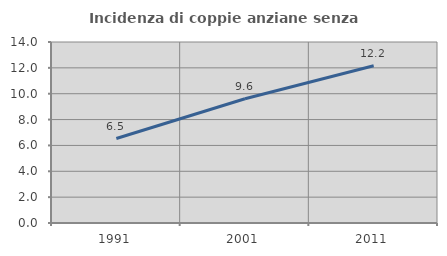
| Category | Incidenza di coppie anziane senza figli  |
|---|---|
| 1991.0 | 6.534 |
| 2001.0 | 9.61 |
| 2011.0 | 12.16 |